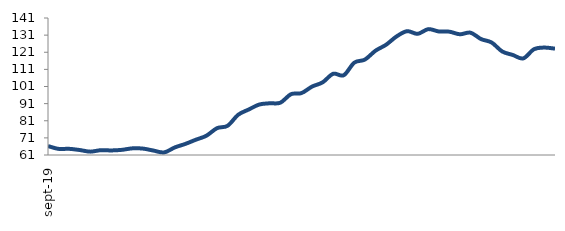
| Category | Series 0 |
|---|---|
| 2019-09-01 | 66.22 |
| 2019-10-01 | 64.573 |
| 2019-11-01 | 64.608 |
| 2019-12-01 | 63.908 |
| 2020-01-01 | 62.959 |
| 2020-02-01 | 63.811 |
| 2020-03-01 | 63.665 |
| 2020-04-01 | 64.013 |
| 2020-05-01 | 64.885 |
| 2020-06-01 | 64.73 |
| 2020-07-01 | 63.568 |
| 2020-08-01 | 62.507 |
| 2020-09-01 | 65.409 |
| 2020-10-01 | 67.466 |
| 2020-11-01 | 69.929 |
| 2020-12-01 | 72.262 |
| 2021-01-01 | 76.667 |
| 2021-02-01 | 78.05 |
| 2021-03-01 | 84.474 |
| 2021-04-01 | 87.564 |
| 2021-05-01 | 90.47 |
| 2021-06-01 | 91.204 |
| 2021-07-01 | 91.538 |
| 2021-08-01 | 96.497 |
| 2021-09-01 | 97.152 |
| 2021-10-01 | 100.957 |
| 2021-11-01 | 103.422 |
| 2021-12-01 | 108.432 |
| 2022-01-01 | 107.584 |
| 2022-02-01 | 114.937 |
| 2022-03-01 | 116.708 |
| 2022-04-01 | 121.877 |
| 2022-05-01 | 125.358 |
| 2022-06-01 | 130.237 |
| 2022-07-01 | 133.304 |
| 2022-08-01 | 131.751 |
| 2022-09-01 | 134.487 |
| 2022-10-01 | 133.139 |
| 2022-11-01 | 133.012 |
| 2022-12-01 | 131.496 |
| 2023-01-01 | 132.43 |
| 2023-02-01 | 128.69 |
| 2023-03-01 | 126.696 |
| 2023-04-01 | 121.465 |
| 2023-05-01 | 119.417 |
| 2023-06-01 | 117.407 |
| 2023-07-01 | 122.739 |
| 2023-08-01 | 123.725 |
| 2023-09-01 | 123.094 |